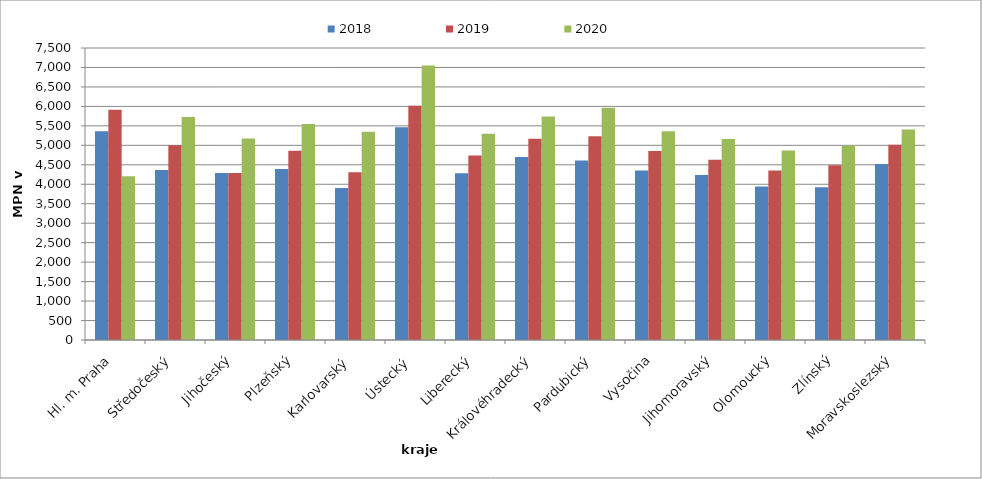
| Category | 2018 | 2019 | 2020 |
|---|---|---|---|
| Hl. m. Praha | 5364 | 5913 | 4204 |
| Středočeský | 4367 | 4999 | 5726 |
| Jihočeský | 4291 | 4291 | 5176 |
| Plzeňský | 4395 | 4864 | 5548 |
| Karlovarský  | 3906 | 4308 | 5350 |
| Ústecký   | 5467 | 6014 | 7050 |
| Liberecký | 4282 | 4736 | 5295 |
| Královéhradecký | 4700 | 5170 | 5739 |
| Pardubický | 4609 | 5234 | 5966 |
| Vysočina | 4356 | 4857 | 5359 |
| Jihomoravský | 4241 | 4632 | 5165 |
| Olomoucký | 3940 | 4354 | 4869 |
| Zlínský | 3924 | 4490 | 4994 |
| Moravskoslezský | 4520 | 5018 | 5407 |